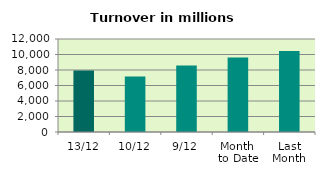
| Category | Series 0 |
|---|---|
| 13/12 | 7926.733 |
| 10/12 | 7153.819 |
| 9/12 | 8568.67 |
| Month 
to Date | 9620.871 |
| Last
Month | 10449.431 |